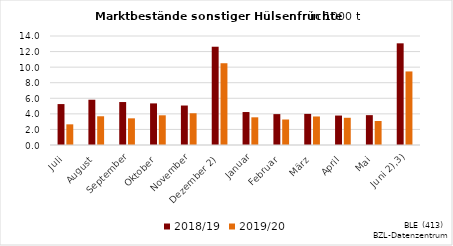
| Category | 2018/19 | 2019/20 |
|---|---|---|
| Juli | 5.256 | 2.654 |
| August | 5.815 | 3.691 |
| September | 5.518 | 3.425 |
| Oktober | 5.344 | 3.814 |
| November | 5.071 | 4.077 |
|  Dezember 2) | 12.622 | 10.502 |
| Januar | 4.234 | 3.556 |
| Februar | 3.967 | 3.274 |
| März | 3.997 | 3.664 |
| April | 3.783 | 3.496 |
| Mai | 3.834 | 3.085 |
|    Juni 2),3) | 13.059 | 9.448 |